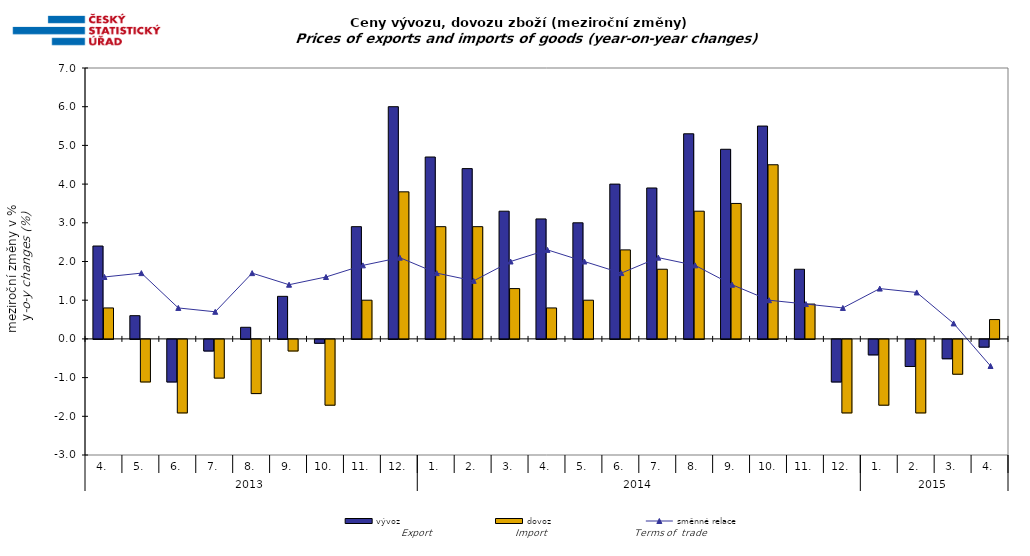
| Category | vývoz | dovoz |
|---|---|---|
| 0 | 2.4 | 0.8 |
| 1 | 0.6 | -1.1 |
| 2 | -1.1 | -1.9 |
| 3 | -0.3 | -1 |
| 4 | 0.3 | -1.4 |
| 5 | 1.1 | -0.3 |
| 6 | -0.1 | -1.7 |
| 7 | 2.9 | 1 |
| 8 | 6 | 3.8 |
| 9 | 4.7 | 2.9 |
| 10 | 4.4 | 2.9 |
| 11 | 3.3 | 1.3 |
| 12 | 3.1 | 0.8 |
| 13 | 3 | 1 |
| 14 | 4 | 2.3 |
| 15 | 3.9 | 1.8 |
| 16 | 5.3 | 3.3 |
| 17 | 4.9 | 3.5 |
| 18 | 5.5 | 4.5 |
| 19 | 1.8 | 0.9 |
| 20 | -1.1 | -1.9 |
| 21 | -0.4 | -1.7 |
| 22 | -0.7 | -1.9 |
| 23 | -0.5 | -0.9 |
| 24 | -0.2 | 0.5 |